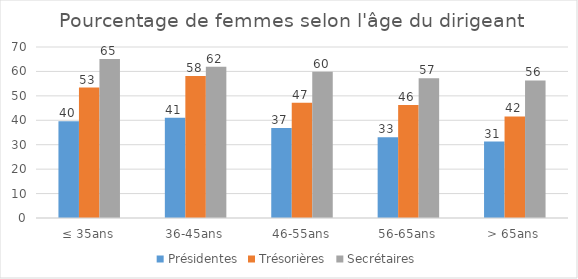
| Category | Présidentes | Trésorières | Secrétaires |
|---|---|---|---|
| ≤ 35ans | 39.6 | 53.4 | 65.1 |
| 36-45ans | 41 | 58.1 | 61.9 |
| 46-55ans | 36.8 | 47.2 | 59.9 |
| 56-65ans | 33.1 | 46.3 | 57.2 |
| > 65ans | 31.3 | 41.6 | 56.3 |